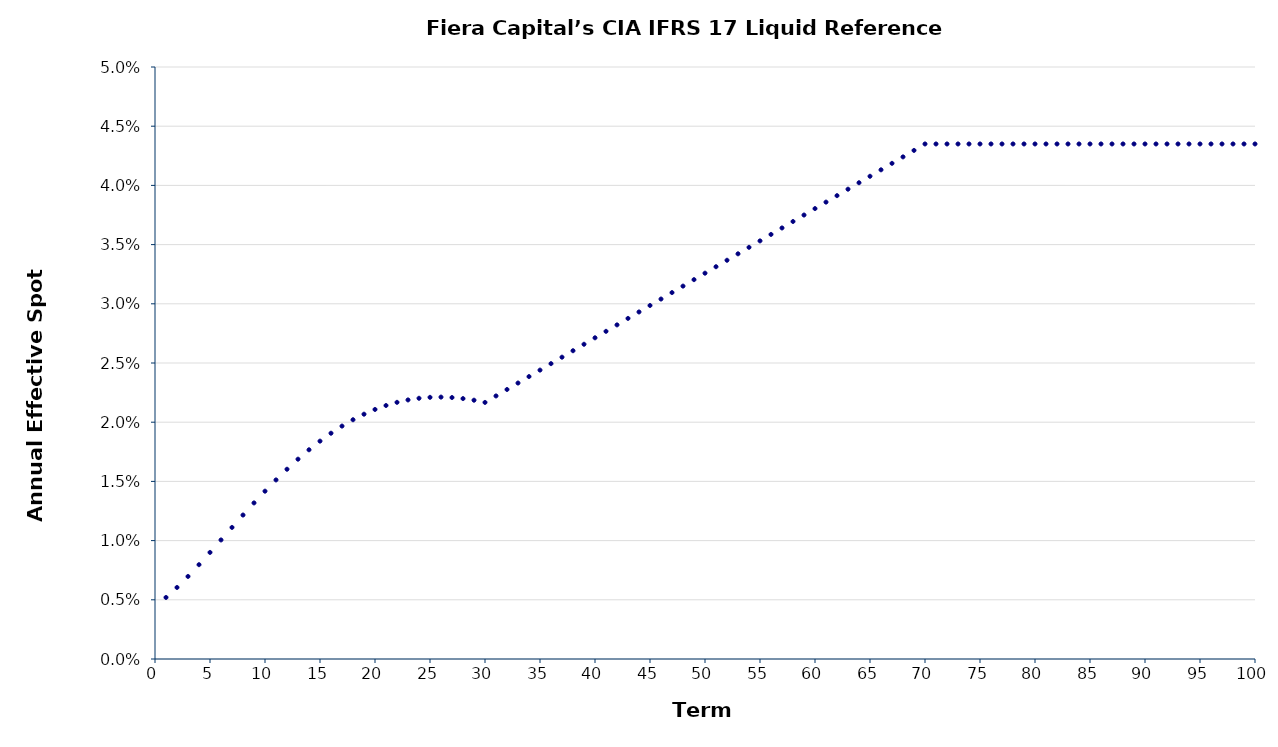
| Category | Annual Effective Spot Rate |
|---|---|
| 1.0 | 0.005 |
| 2.0 | 0.006 |
| 3.0 | 0.007 |
| 4.0 | 0.008 |
| 5.0 | 0.009 |
| 6.0 | 0.01 |
| 7.0 | 0.011 |
| 8.0 | 0.012 |
| 9.0 | 0.013 |
| 10.0 | 0.014 |
| 11.0 | 0.015 |
| 12.0 | 0.016 |
| 13.0 | 0.017 |
| 14.0 | 0.018 |
| 15.0 | 0.018 |
| 16.0 | 0.019 |
| 17.0 | 0.02 |
| 18.0 | 0.02 |
| 19.0 | 0.021 |
| 20.0 | 0.021 |
| 21.0 | 0.021 |
| 22.0 | 0.022 |
| 23.0 | 0.022 |
| 24.0 | 0.022 |
| 25.0 | 0.022 |
| 26.0 | 0.022 |
| 27.0 | 0.022 |
| 28.0 | 0.022 |
| 29.0 | 0.022 |
| 30.0 | 0.022 |
| 31.0 | 0.022 |
| 32.0 | 0.023 |
| 33.0 | 0.023 |
| 34.0 | 0.024 |
| 35.0 | 0.024 |
| 36.0 | 0.025 |
| 37.0 | 0.025 |
| 38.0 | 0.026 |
| 39.0 | 0.027 |
| 40.0 | 0.027 |
| 41.0 | 0.028 |
| 42.0 | 0.028 |
| 43.0 | 0.029 |
| 44.0 | 0.029 |
| 45.0 | 0.03 |
| 46.0 | 0.03 |
| 47.0 | 0.031 |
| 48.0 | 0.031 |
| 49.0 | 0.032 |
| 50.0 | 0.033 |
| 51.0 | 0.033 |
| 52.0 | 0.034 |
| 53.0 | 0.034 |
| 54.0 | 0.035 |
| 55.0 | 0.035 |
| 56.0 | 0.036 |
| 57.0 | 0.036 |
| 58.0 | 0.037 |
| 59.0 | 0.037 |
| 60.0 | 0.038 |
| 61.0 | 0.039 |
| 62.0 | 0.039 |
| 63.0 | 0.04 |
| 64.0 | 0.04 |
| 65.0 | 0.041 |
| 66.0 | 0.041 |
| 67.0 | 0.042 |
| 68.0 | 0.042 |
| 69.0 | 0.043 |
| 70.0 | 0.044 |
| 71.0 | 0.044 |
| 72.0 | 0.044 |
| 73.0 | 0.044 |
| 74.0 | 0.044 |
| 75.0 | 0.044 |
| 76.0 | 0.044 |
| 77.0 | 0.044 |
| 78.0 | 0.044 |
| 79.0 | 0.044 |
| 80.0 | 0.044 |
| 81.0 | 0.044 |
| 82.0 | 0.044 |
| 83.0 | 0.044 |
| 84.0 | 0.044 |
| 85.0 | 0.044 |
| 86.0 | 0.044 |
| 87.0 | 0.044 |
| 88.0 | 0.044 |
| 89.0 | 0.044 |
| 90.0 | 0.044 |
| 91.0 | 0.044 |
| 92.0 | 0.044 |
| 93.0 | 0.044 |
| 94.0 | 0.044 |
| 95.0 | 0.044 |
| 96.0 | 0.044 |
| 97.0 | 0.044 |
| 98.0 | 0.044 |
| 99.0 | 0.044 |
| 100.0 | 0.044 |